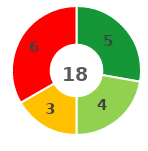
| Category | Series 0 |
|---|---|
| 0 | 5 |
| 1 | 4 |
| 2 | 3 |
| 3 | 6 |
| 4 | 0 |